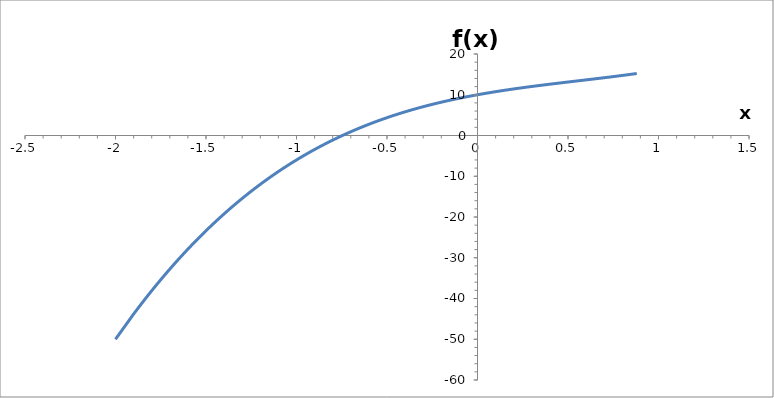
| Category | f(x) |
|---|---|
| -2.0 | -50 |
| -1.9 | -43.827 |
| -1.89 | -43.234 |
| -1.88 | -42.646 |
| -1.8699999999999999 | -42.062 |
| -1.8599999999999999 | -41.483 |
| -1.8499999999999999 | -40.907 |
| -1.8399999999999999 | -40.337 |
| -1.8299999999999998 | -39.77 |
| -1.8199999999999998 | -39.208 |
| -1.8099999999999998 | -38.65 |
| -1.7999999999999998 | -38.096 |
| -1.7899999999999998 | -37.547 |
| -1.7799999999999998 | -37.001 |
| -1.7699999999999998 | -36.46 |
| -1.7599999999999998 | -35.923 |
| -1.7499999999999998 | -35.391 |
| -1.7399999999999998 | -34.862 |
| -1.7299999999999998 | -34.338 |
| -1.7199999999999998 | -33.817 |
| -1.7099999999999997 | -33.301 |
| -1.6999999999999997 | -32.789 |
| -1.6899999999999997 | -32.281 |
| -1.6799999999999997 | -31.777 |
| -1.6699999999999997 | -31.277 |
| -1.6599999999999997 | -30.781 |
| -1.6499999999999997 | -30.289 |
| -1.6399999999999997 | -29.801 |
| -1.6299999999999997 | -29.317 |
| -1.6199999999999997 | -28.837 |
| -1.6099999999999997 | -28.36 |
| -1.5999999999999996 | -27.888 |
| -1.5899999999999996 | -27.42 |
| -1.5799999999999996 | -26.955 |
| -1.5699999999999996 | -26.494 |
| -1.5599999999999996 | -26.037 |
| -1.5499999999999996 | -25.584 |
| -1.5399999999999996 | -25.135 |
| -1.5299999999999996 | -24.689 |
| -1.5199999999999996 | -24.247 |
| -1.5099999999999996 | -23.809 |
| -1.4999999999999996 | -23.375 |
| -1.4899999999999995 | -22.944 |
| -1.4799999999999995 | -22.517 |
| -1.4699999999999995 | -22.094 |
| -1.4599999999999995 | -21.674 |
| -1.4499999999999995 | -21.258 |
| -1.4399999999999995 | -20.846 |
| -1.4299999999999995 | -20.437 |
| -1.4199999999999995 | -20.032 |
| -1.4099999999999995 | -19.63 |
| -1.3999999999999995 | -19.232 |
| -1.3899999999999995 | -18.837 |
| -1.3799999999999994 | -18.446 |
| -1.3699999999999994 | -18.059 |
| -1.3599999999999994 | -17.674 |
| -1.3499999999999994 | -17.294 |
| -1.3399999999999994 | -16.916 |
| -1.3299999999999994 | -16.542 |
| -1.3199999999999994 | -16.172 |
| -1.3099999999999994 | -15.805 |
| -1.2999999999999994 | -15.441 |
| -1.2899999999999994 | -15.081 |
| -1.2799999999999994 | -14.723 |
| -1.2699999999999994 | -14.37 |
| -1.2599999999999993 | -14.019 |
| -1.2499999999999993 | -13.672 |
| -1.2399999999999993 | -13.328 |
| -1.2299999999999993 | -12.987 |
| -1.2199999999999993 | -12.65 |
| -1.2099999999999993 | -12.315 |
| -1.1999999999999993 | -11.984 |
| -1.1899999999999993 | -11.656 |
| -1.1799999999999993 | -11.331 |
| -1.1699999999999993 | -11.009 |
| -1.1599999999999993 | -10.691 |
| -1.1499999999999992 | -10.375 |
| -1.1399999999999992 | -10.063 |
| -1.1299999999999992 | -9.753 |
| -1.1199999999999992 | -9.447 |
| -1.1099999999999992 | -9.143 |
| -1.0999999999999992 | -8.843 |
| -1.0899999999999992 | -8.546 |
| -1.0799999999999992 | -8.251 |
| -1.0699999999999992 | -7.96 |
| -1.0599999999999992 | -7.671 |
| -1.0499999999999992 | -7.385 |
| -1.0399999999999991 | -7.103 |
| -1.0299999999999991 | -6.823 |
| -1.0199999999999991 | -6.546 |
| -1.0099999999999991 | -6.271 |
| -0.9999999999999991 | -6 |
| -0.9899999999999991 | -5.731 |
| -0.9799999999999991 | -5.466 |
| -0.9699999999999991 | -5.203 |
| -0.9599999999999991 | -4.942 |
| -0.9499999999999991 | -4.685 |
| -0.9399999999999991 | -4.43 |
| -0.929999999999999 | -4.178 |
| -0.919999999999999 | -3.928 |
| -0.909999999999999 | -3.681 |
| -0.899999999999999 | -3.437 |
| -0.889999999999999 | -3.195 |
| -0.879999999999999 | -2.956 |
| -0.869999999999999 | -2.72 |
| -0.859999999999999 | -2.486 |
| -0.849999999999999 | -2.255 |
| -0.839999999999999 | -2.026 |
| -0.829999999999999 | -1.8 |
| -0.819999999999999 | -1.576 |
| -0.8099999999999989 | -1.355 |
| -0.7999999999999989 | -1.136 |
| -0.7899999999999989 | -0.92 |
| -0.7799999999999989 | -0.706 |
| -0.7699999999999989 | -0.494 |
| -0.7599999999999989 | -0.285 |
| -0.7499999999999989 | -0.078 |
| -0.7399999999999989 | 0.126 |
| -0.7299999999999989 | 0.328 |
| -0.7199999999999989 | 0.528 |
| -0.7099999999999989 | 0.726 |
| -0.6999999999999988 | 0.921 |
| -0.6899999999999988 | 1.114 |
| -0.6799999999999988 | 1.305 |
| -0.6699999999999988 | 1.493 |
| -0.6599999999999988 | 1.68 |
| -0.6499999999999988 | 1.864 |
| -0.6399999999999988 | 2.046 |
| -0.6299999999999988 | 2.225 |
| -0.6199999999999988 | 2.403 |
| -0.6099999999999988 | 2.579 |
| -0.5999999999999988 | 2.752 |
| -0.5899999999999987 | 2.923 |
| -0.5799999999999987 | 3.093 |
| -0.5699999999999987 | 3.26 |
| -0.5599999999999987 | 3.425 |
| -0.5499999999999987 | 3.588 |
| -0.5399999999999987 | 3.75 |
| -0.5299999999999987 | 3.909 |
| -0.5199999999999987 | 4.066 |
| -0.5099999999999987 | 4.222 |
| -0.49999999999999867 | 4.375 |
| -0.48999999999999866 | 4.527 |
| -0.47999999999999865 | 4.676 |
| -0.46999999999999864 | 4.824 |
| -0.45999999999999863 | 4.97 |
| -0.4499999999999986 | 5.114 |
| -0.4399999999999986 | 5.256 |
| -0.4299999999999986 | 5.397 |
| -0.4199999999999986 | 5.536 |
| -0.4099999999999986 | 5.673 |
| -0.3999999999999986 | 5.808 |
| -0.38999999999999857 | 5.942 |
| -0.37999999999999856 | 6.073 |
| -0.36999999999999855 | 6.204 |
| -0.35999999999999854 | 6.332 |
| -0.34999999999999853 | 6.459 |
| -0.3399999999999985 | 6.584 |
| -0.3299999999999985 | 6.708 |
| -0.3199999999999985 | 6.83 |
| -0.3099999999999985 | 6.95 |
| -0.2999999999999985 | 7.069 |
| -0.2899999999999985 | 7.186 |
| -0.2799999999999985 | 7.302 |
| -0.26999999999999846 | 7.416 |
| -0.25999999999999845 | 7.529 |
| -0.24999999999999845 | 7.641 |
| -0.23999999999999844 | 7.751 |
| -0.22999999999999843 | 7.859 |
| -0.21999999999999842 | 7.966 |
| -0.2099999999999984 | 8.072 |
| -0.1999999999999984 | 8.176 |
| -0.1899999999999984 | 8.279 |
| -0.17999999999999838 | 8.381 |
| -0.16999999999999837 | 8.481 |
| -0.15999999999999837 | 8.58 |
| -0.14999999999999836 | 8.677 |
| -0.13999999999999835 | 8.774 |
| -0.12999999999999834 | 8.869 |
| -0.11999999999999834 | 8.963 |
| -0.10999999999999835 | 9.056 |
| -0.09999999999999835 | 9.147 |
| -0.08999999999999836 | 9.237 |
| -0.07999999999999836 | 9.326 |
| -0.06999999999999837 | 9.414 |
| -0.05999999999999837 | 9.501 |
| -0.049999999999998365 | 9.587 |
| -0.03999999999999836 | 9.672 |
| -0.02999999999999836 | 9.755 |
| -0.01999999999999836 | 9.838 |
| -0.00999999999999836 | 9.919 |
| 1.6410484082740595e-15 | 10 |
| 0.010000000000001641 | 10.08 |
| 0.02000000000000164 | 10.158 |
| 0.030000000000001643 | 10.236 |
| 0.040000000000001645 | 10.312 |
| 0.05000000000000165 | 10.388 |
| 0.06000000000000165 | 10.463 |
| 0.07000000000000164 | 10.537 |
| 0.08000000000000164 | 10.61 |
| 0.09000000000000163 | 10.682 |
| 0.10000000000000163 | 10.753 |
| 0.11000000000000162 | 10.823 |
| 0.12000000000000162 | 10.893 |
| 0.13000000000000161 | 10.962 |
| 0.14000000000000162 | 11.03 |
| 0.15000000000000163 | 11.098 |
| 0.16000000000000164 | 11.164 |
| 0.17000000000000165 | 11.23 |
| 0.18000000000000166 | 11.295 |
| 0.19000000000000167 | 11.36 |
| 0.20000000000000168 | 11.424 |
| 0.21000000000000169 | 11.487 |
| 0.2200000000000017 | 11.55 |
| 0.2300000000000017 | 11.612 |
| 0.2400000000000017 | 11.673 |
| 0.2500000000000017 | 11.734 |
| 0.26000000000000173 | 11.795 |
| 0.27000000000000174 | 11.855 |
| 0.28000000000000175 | 11.914 |
| 0.29000000000000176 | 11.973 |
| 0.30000000000000177 | 12.031 |
| 0.3100000000000018 | 12.089 |
| 0.3200000000000018 | 12.146 |
| 0.3300000000000018 | 12.203 |
| 0.3400000000000018 | 12.26 |
| 0.3500000000000018 | 12.316 |
| 0.3600000000000018 | 12.372 |
| 0.3700000000000018 | 12.427 |
| 0.38000000000000184 | 12.483 |
| 0.39000000000000185 | 12.537 |
| 0.40000000000000185 | 12.592 |
| 0.41000000000000186 | 12.646 |
| 0.42000000000000187 | 12.7 |
| 0.4300000000000019 | 12.754 |
| 0.4400000000000019 | 12.808 |
| 0.4500000000000019 | 12.861 |
| 0.4600000000000019 | 12.914 |
| 0.4700000000000019 | 12.967 |
| 0.4800000000000019 | 13.02 |
| 0.49000000000000193 | 13.072 |
| 0.5000000000000019 | 13.125 |
| 0.5100000000000019 | 13.177 |
| 0.5200000000000019 | 13.23 |
| 0.5300000000000019 | 13.282 |
| 0.5400000000000019 | 13.334 |
| 0.5500000000000019 | 13.387 |
| 0.5600000000000019 | 13.439 |
| 0.570000000000002 | 13.491 |
| 0.580000000000002 | 13.543 |
| 0.590000000000002 | 13.596 |
| 0.600000000000002 | 13.648 |
| 0.610000000000002 | 13.7 |
| 0.620000000000002 | 13.753 |
| 0.630000000000002 | 13.806 |
| 0.640000000000002 | 13.858 |
| 0.650000000000002 | 13.911 |
| 0.660000000000002 | 13.964 |
| 0.670000000000002 | 14.018 |
| 0.680000000000002 | 14.071 |
| 0.6900000000000021 | 14.125 |
| 0.7000000000000021 | 14.179 |
| 0.7100000000000021 | 14.233 |
| 0.7200000000000021 | 14.288 |
| 0.7300000000000021 | 14.343 |
| 0.7400000000000021 | 14.398 |
| 0.7500000000000021 | 14.453 |
| 0.7600000000000021 | 14.509 |
| 0.7700000000000021 | 14.565 |
| 0.7800000000000021 | 14.622 |
| 0.7900000000000021 | 14.679 |
| 0.8000000000000022 | 14.736 |
| 0.8100000000000022 | 14.794 |
| 0.8200000000000022 | 14.852 |
| 0.8300000000000022 | 14.911 |
| 0.8400000000000022 | 14.97 |
| 0.8500000000000022 | 15.03 |
| 0.8600000000000022 | 15.09 |
| 0.8700000000000022 | 15.151 |
| 0.8800000000000022 | 15.212 |